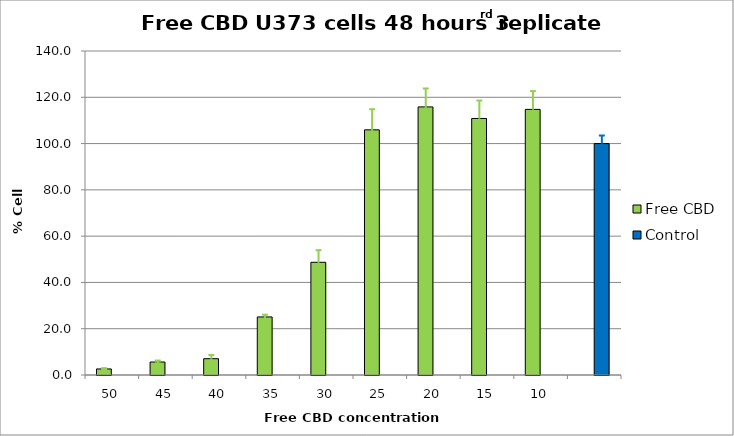
| Category | Free CBD | Control |
|---|---|---|
| 50.0 | 2.619 |  |
| 45.0 | 5.613 |  |
| 40.0 | 7.043 |  |
| 35.0 | 25.083 |  |
| 30.0 | 48.701 |  |
| 25.0 | 105.928 |  |
| 20.0 | 115.839 |  |
| 15.0 | 110.847 |  |
| 10.0 | 114.772 |  |